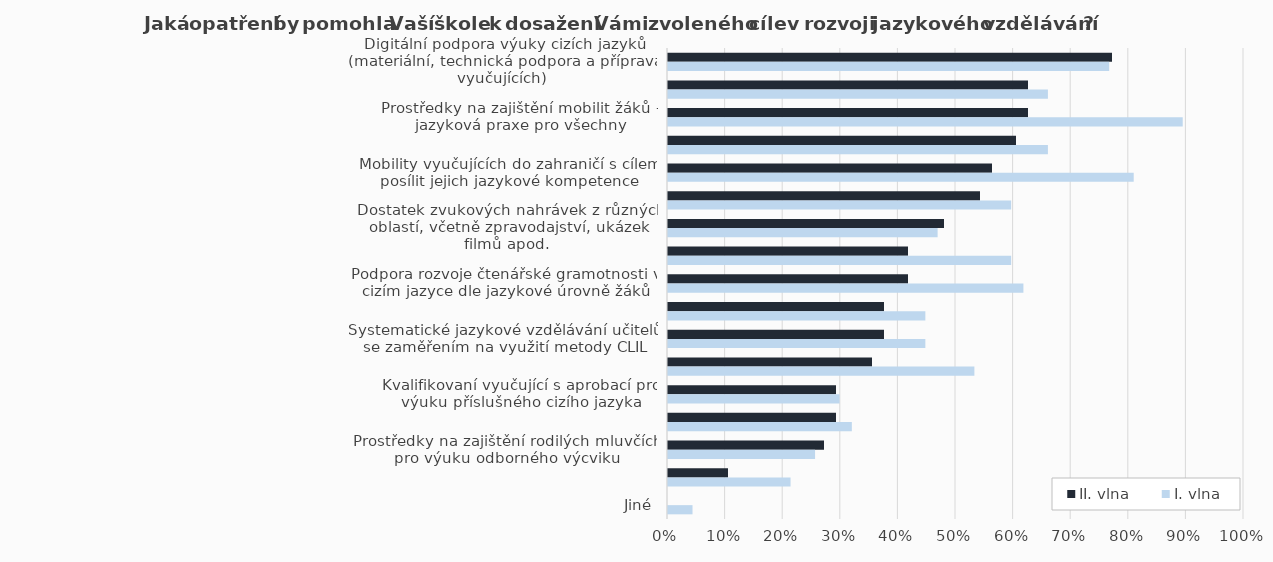
| Category | II. vlna | I. vlna |
|---|---|---|
| Digitální podpora výuky cizích jazyků (materiální, technická podpora a příprava vyučujících) | 0.771 | 0.766 |
| Vytvoření podmínek pro diferenciaci výuky podle úrovně žáků | 0.625 | 0.66 |
| Prostředky na zajištění mobilit žáků – jazyková praxe pro všechny | 0.625 | 0.894 |
| Výukové materiály cizích jazyků s tematickým nebo odborným zaměřením | 0.604 | 0.66 |
| Mobility vyučujících do zahraničí s cílem posílit jejich jazykové kompetence | 0.562 | 0.809 |
| Prostředky na výuku vedenou rodilým mluvčím, nejlépe kvalifikovaným | 0.542 | 0.596 |
| Dostatek zvukových nahrávek z různých oblastí, včetně zpravodajství, ukázek filmů apod. | 0.479 | 0.468 |
| Vyučující cizího jazyka se budou orientovat v oboru, pro který se jejich žáci připravují | 0.417 | 0.596 |
| Podpora rozvoje čtenářské gramotnosti v cizím jazyce dle jazykové úrovně žáků | 0.417 | 0.617 |
| Prostředky pro realizaci aktivit s různou úrovní náročnosti | 0.375 | 0.447 |
| Systematické jazykové vzdělávání učitelů se zaměřením na využití metody CLIL | 0.375 | 0.447 |
| Systematické jazykové vzdělávání pro učitele odborných předmětů včetně zaměření na obor | 0.354 | 0.532 |
| Kvalifikovaní vyučující s aprobací pro výuku příslušného cizího jazyka | 0.292 | 0.298 |
| Sdílení dobré praxe a síťování škol s podobným zaměřením | 0.292 | 0.319 |
| Prostředky na zajištění rodilých mluvčích pro výuku odborného výcviku | 0.271 | 0.255 |
| Zřízení funkce poradce/předsedy předmětové komise pro rozvoj a další podporu oblasti | 0.104 | 0.213 |
| Jiné | 0 | 0.043 |